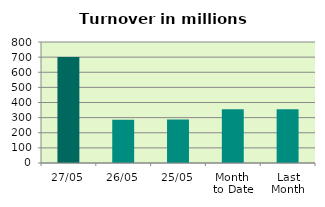
| Category | Series 0 |
|---|---|
| 27/05 | 700.928 |
| 26/05 | 285.135 |
| 25/05 | 287.303 |
| Month 
to Date | 356.076 |
| Last
Month | 356.105 |